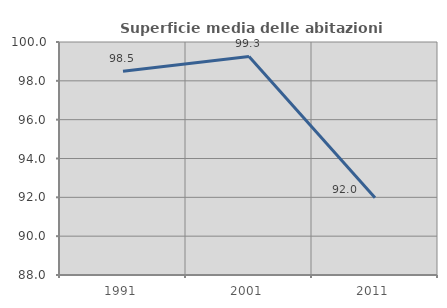
| Category | Superficie media delle abitazioni occupate |
|---|---|
| 1991.0 | 98.491 |
| 2001.0 | 99.255 |
| 2011.0 | 91.978 |